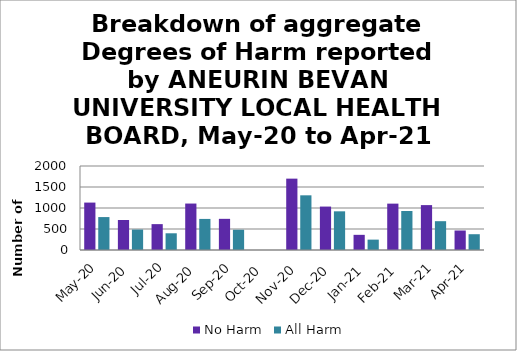
| Category | No Harm | All Harm |
|---|---|---|
| May-20 | 1129 | 784 |
| Jun-20 | 715 | 487 |
| Jul-20 | 616 | 398 |
| Aug-20 | 1106 | 740 |
| Sep-20 | 742 | 482 |
| Oct-20 | 0 | 0 |
| Nov-20 | 1699 | 1302 |
| Dec-20 | 1034 | 921 |
| Jan-21 | 361 | 247 |
| Feb-21 | 1104 | 929 |
| Mar-21 | 1069 | 686 |
| Apr-21 | 464 | 376 |